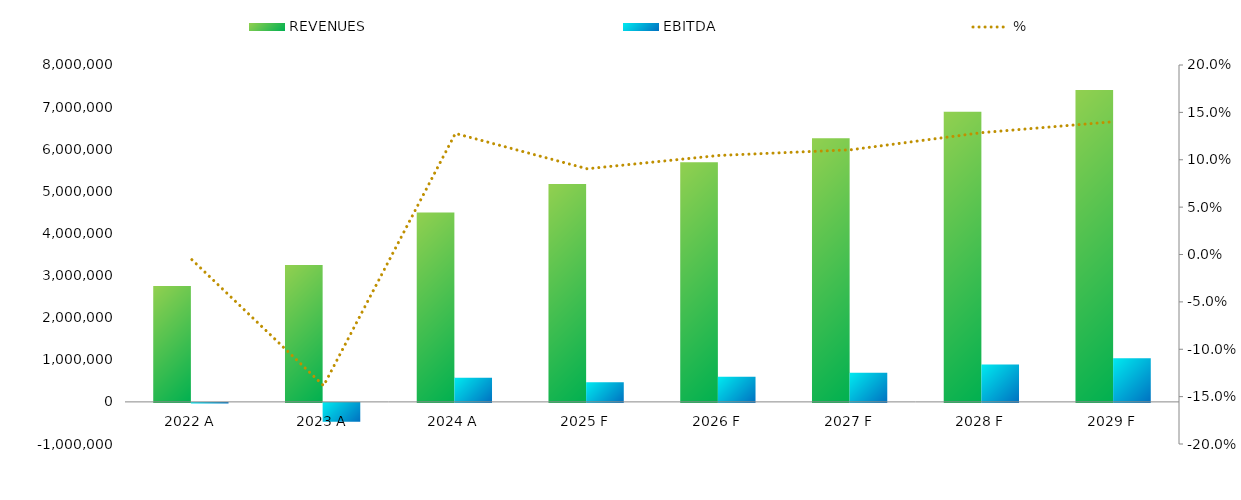
| Category | REVENUES | EBITDA |
|---|---|---|
| 2022.0 | 2750000 | -15000 |
| 2023.0 | 3250000 | -450000 |
| 2024.0 | 4500000 | 575000 |
| 2025.0 | 5175000 | 468250 |
| 2026.0 | 5692500 | 595075 |
| 2027.0 | 6261750 | 692082.5 |
| 2028.0 | 6887925 | 886290.75 |
| 2029.0 | 7404519.375 | 1037762.556 |